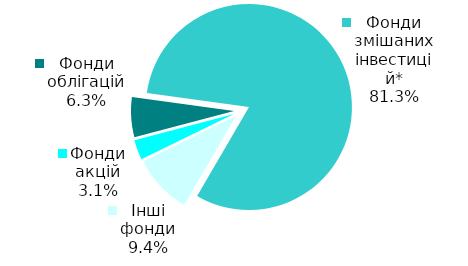
| Category | Series 0 |
|---|---|
| Фонди акцій | 1 |
| Фонди облігацій | 2 |
| Фонди змішаних інвестицій* | 26 |
| Інші фонди | 3 |